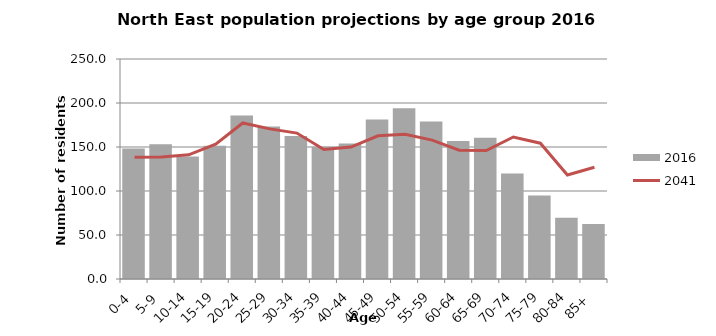
| Category | 2016 |
|---|---|
| 0-4 | 148.381 |
| 5-9 | 153.002 |
| 10-14 | 139.095 |
| 15-19 | 151.507 |
| 20-24 | 185.797 |
| 25-29 | 173.171 |
| 30-34 | 162.634 |
| 35-39 | 150.205 |
| 40-44 | 153.962 |
| 45-49 | 181.367 |
| 50-54 | 194.072 |
| 55-59 | 179.097 |
| 60-64 | 156.736 |
| 65-69 | 160.507 |
| 70-74 | 119.903 |
| 75-79 | 94.919 |
| 80-84 | 69.648 |
| 85+ | 62.586 |